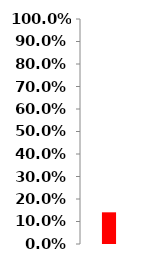
| Category | Series 0 |
|---|---|
| 0 | 0.141 |